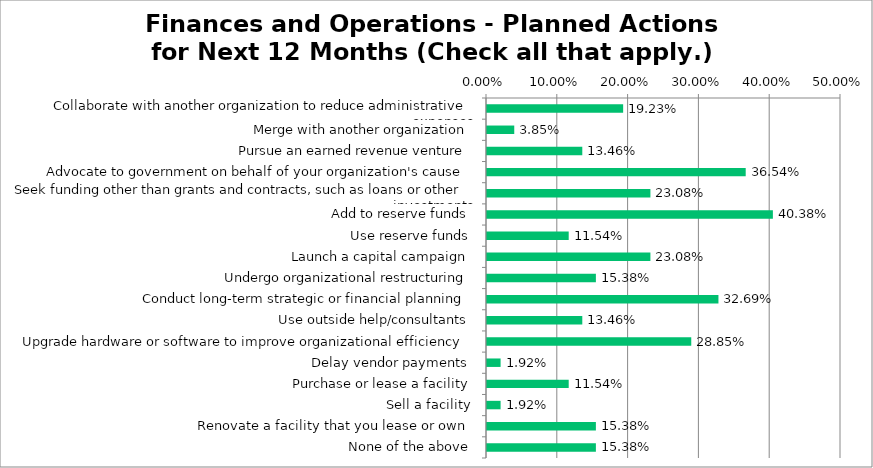
| Category | Responses |
|---|---|
| Collaborate with another organization to reduce administrative expenses | 0.192 |
| Merge with another organization | 0.038 |
| Pursue an earned revenue venture | 0.135 |
| Advocate to government on behalf of your organization's cause | 0.365 |
| Seek funding other than grants and contracts, such as loans or other investments | 0.231 |
| Add to reserve funds | 0.404 |
| Use reserve funds | 0.115 |
| Launch a capital campaign | 0.231 |
| Undergo organizational restructuring | 0.154 |
| Conduct long-term strategic or financial planning | 0.327 |
| Use outside help/consultants | 0.135 |
| Upgrade hardware or software to improve organizational efficiency | 0.288 |
| Delay vendor payments | 0.019 |
| Purchase or lease a facility | 0.115 |
| Sell a facility | 0.019 |
| Renovate a facility that you lease or own | 0.154 |
| None of the above | 0.154 |